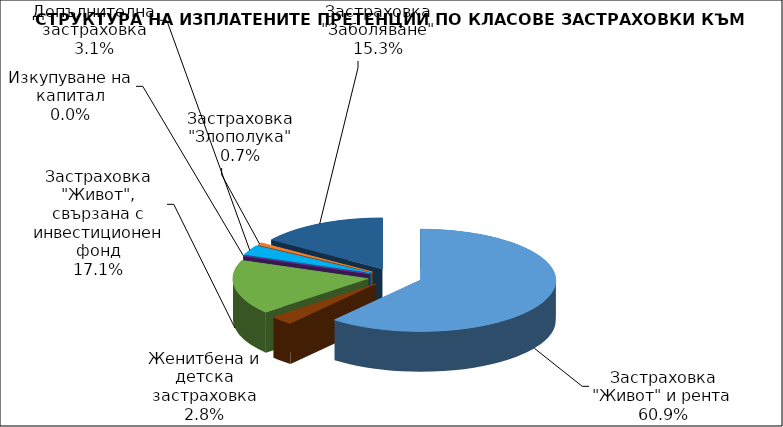
| Category | Застраховка "Живот" и рента |
|---|---|
| Застраховка "Живот" и рента | 89209408.989 |
| Женитбена и детска застраховка | 4081051.299 |
| Застраховка "Живот", свързана с инвестиционен фонд | 25123337.153 |
| Изкупуване на капитал | 0 |
| Допълнителна застраховка | 4592753.626 |
| Застраховка "Злополука" | 1050465.367 |
| Застраховка "Заболяване" | 22465636.299 |